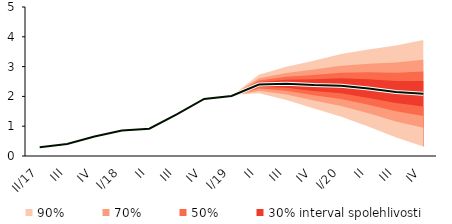
| Category | linka | Centerline |
|---|---|---|
| II/17 | 0.294 | 0.294 |
| III | 0.402 | 0.402 |
| IV | 0.654 | 0.654 |
| I/18 | 0.857 | 0.857 |
| II | 0.916 | 0.916 |
| III | 1.393 | 1.393 |
| IV | 1.913 | 1.913 |
| I/19 | 2.013 | 2.013 |
| II | 2.399 | 2.399 |
| III | 2.425 | 2.425 |
| IV | 2.38 | 2.38 |
| I/20 | 2.355 | 2.355 |
| II | 2.262 | 2.262 |
| III | 2.148 | 2.148 |
| IV | 2.09 | 2.09 |